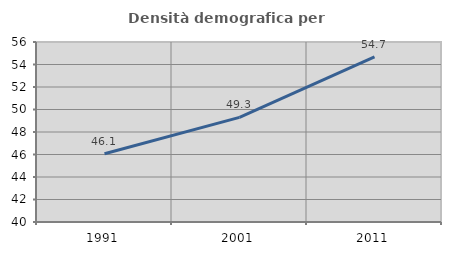
| Category | Densità demografica |
|---|---|
| 1991.0 | 46.067 |
| 2001.0 | 49.296 |
| 2011.0 | 54.678 |